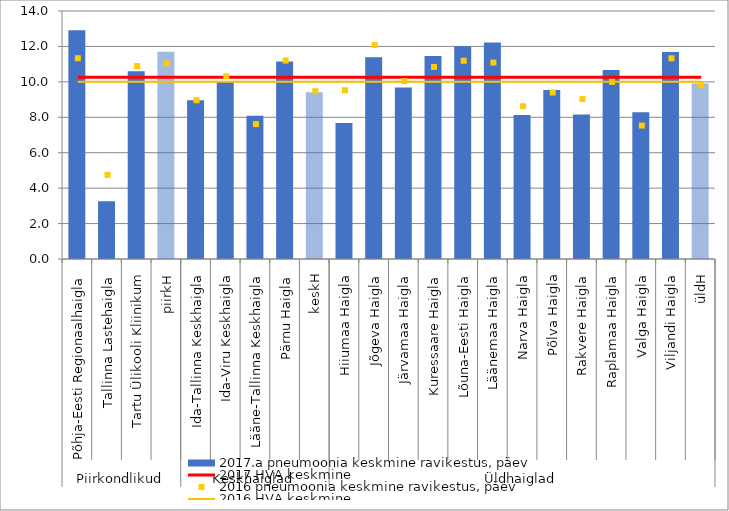
| Category | 2017.a pneumoonia keskmine ravikestus, päev |
|---|---|
| 0 | 12.915 |
| 1 | 3.267 |
| 2 | 10.605 |
| 3 | 11.693 |
| 4 | 8.964 |
| 5 | 10.053 |
| 6 | 8.08 |
| 7 | 11.15 |
| 8 | 9.416 |
| 9 | 7.682 |
| 10 | 11.383 |
| 11 | 9.677 |
| 12 | 11.465 |
| 13 | 12.009 |
| 14 | 12.224 |
| 15 | 8.133 |
| 16 | 9.543 |
| 17 | 8.156 |
| 18 | 10.662 |
| 19 | 8.278 |
| 20 | 11.68 |
| 21 | 9.901 |